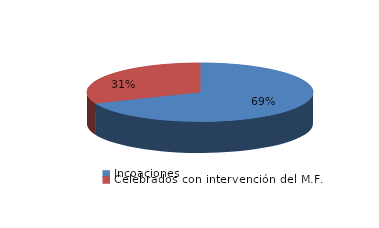
| Category | Series 0 |
|---|---|
| Incoaciones | 4486 |
| Celebrados con intervención del M.F. | 2042 |